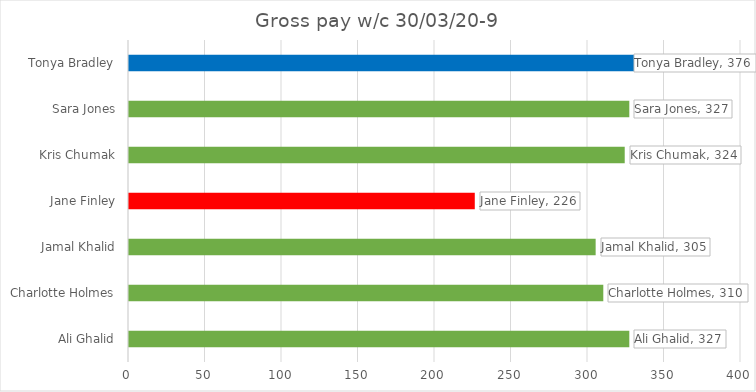
| Category | Series 5 |
|---|---|
| Ali Ghalid | 327 |
| Charlotte Holmes | 310 |
| Jamal Khalid | 305 |
| Jane Finley | 226 |
| Kris Chumak | 324 |
| Sara Jones | 327 |
| Tonya Bradley | 376 |